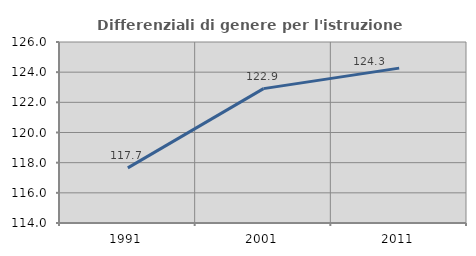
| Category | Differenziali di genere per l'istruzione superiore |
|---|---|
| 1991.0 | 117.652 |
| 2001.0 | 122.908 |
| 2011.0 | 124.267 |